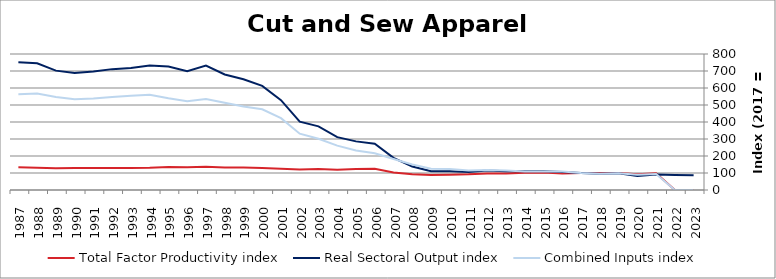
| Category | Total Factor Productivity index | Real Sectoral Output index | Combined Inputs index |
|---|---|---|---|
| 2023.0 | 0 | 86.362 | 0 |
| 2022.0 | 0 | 88.484 | 0 |
| 2021.0 | 97.905 | 91.628 | 93.588 |
| 2020.0 | 92.455 | 82.793 | 89.549 |
| 2019.0 | 100.64 | 99.101 | 98.47 |
| 2018.0 | 99.876 | 95.04 | 95.158 |
| 2017.0 | 100 | 100 | 100 |
| 2016.0 | 97.233 | 106.077 | 109.096 |
| 2015.0 | 102.371 | 110.681 | 108.118 |
| 2014.0 | 102.134 | 110.592 | 108.281 |
| 2013.0 | 96.917 | 110.868 | 114.395 |
| 2012.0 | 97.699 | 114.421 | 117.115 |
| 2011.0 | 92.371 | 106.407 | 115.196 |
| 2010.0 | 89.819 | 110.335 | 122.841 |
| 2009.0 | 88.592 | 110.776 | 125.041 |
| 2008.0 | 92.07 | 137.938 | 149.82 |
| 2007.0 | 103.259 | 188.697 | 182.742 |
| 2006.0 | 125.511 | 271.915 | 216.646 |
| 2005.0 | 122.96 | 286.018 | 232.612 |
| 2004.0 | 119.066 | 310.877 | 261.097 |
| 2003.0 | 124.076 | 374.283 | 301.657 |
| 2002.0 | 121.27 | 401.718 | 331.259 |
| 2001.0 | 124.898 | 528.156 | 422.87 |
| 2000.0 | 129.033 | 612.38 | 474.592 |
| 1999.0 | 132.718 | 651.278 | 490.723 |
| 1998.0 | 132.26 | 679.578 | 513.818 |
| 1997.0 | 136.858 | 731.857 | 534.756 |
| 1996.0 | 133.954 | 699.006 | 521.825 |
| 1995.0 | 134.7 | 726.904 | 539.648 |
| 1994.0 | 130.545 | 731.655 | 560.463 |
| 1993.0 | 129.617 | 718.275 | 554.152 |
| 1992.0 | 129.925 | 711.01 | 547.248 |
| 1991.0 | 129.571 | 697.381 | 538.223 |
| 1990.0 | 128.822 | 687.923 | 534.01 |
| 1989.0 | 128.189 | 702.084 | 547.696 |
| 1988.0 | 131.451 | 745.692 | 567.278 |
| 1987.0 | 133.472 | 752.138 | 563.519 |